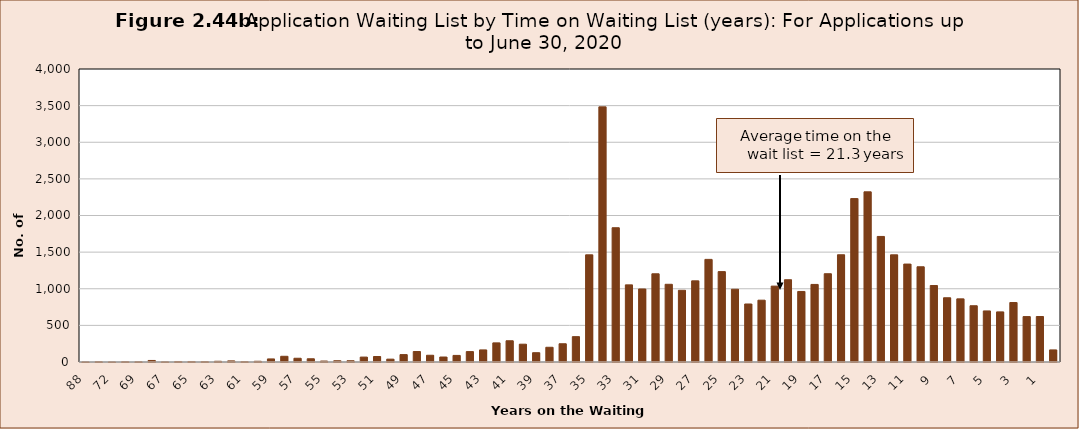
| Category | Series 0 |
|---|---|
| 88.0 | 1 |
| 73.0 | 4 |
| 72.0 | 1 |
| 70.0 | 4 |
| 69.0 | 3 |
| 68.0 | 21 |
| 67.0 | 2 |
| 66.0 | 7 |
| 65.0 | 7 |
| 64.0 | 5 |
| 63.0 | 10 |
| 62.0 | 15 |
| 61.0 | 5 |
| 60.0 | 10 |
| 59.0 | 42 |
| 58.0 | 78 |
| 57.0 | 51 |
| 56.0 | 44 |
| 55.0 | 13 |
| 54.0 | 17 |
| 53.0 | 17 |
| 52.0 | 67 |
| 51.0 | 75 |
| 50.0 | 39 |
| 49.0 | 101 |
| 48.0 | 143 |
| 47.0 | 92 |
| 46.0 | 68 |
| 45.0 | 90 |
| 44.0 | 142 |
| 43.0 | 165 |
| 42.0 | 261 |
| 41.0 | 290 |
| 40.0 | 243 |
| 39.0 | 127 |
| 38.0 | 201 |
| 37.0 | 249 |
| 36.0 | 346 |
| 35.0 | 1463 |
| 34.0 | 3483 |
| 33.0 | 1833 |
| 32.0 | 1053 |
| 31.0 | 997 |
| 30.0 | 1204 |
| 29.0 | 1061 |
| 28.0 | 979 |
| 27.0 | 1108 |
| 26.0 | 1401 |
| 25.0 | 1234 |
| 24.0 | 993 |
| 23.0 | 792 |
| 22.0 | 844 |
| 21.0 | 1036 |
| 20.0 | 1123 |
| 19.0 | 963 |
| 18.0 | 1059 |
| 17.0 | 1205 |
| 16.0 | 1464 |
| 15.0 | 2231 |
| 14.0 | 2323 |
| 13.0 | 1714 |
| 12.0 | 1463 |
| 11.0 | 1337 |
| 10.0 | 1300 |
| 9.0 | 1044 |
| 8.0 | 877 |
| 7.0 | 862 |
| 6.0 | 768 |
| 5.0 | 697 |
| 4.0 | 684 |
| 3.0 | 812 |
| 2.0 | 620 |
| 1.0 | 621 |
| 0.0 | 165 |